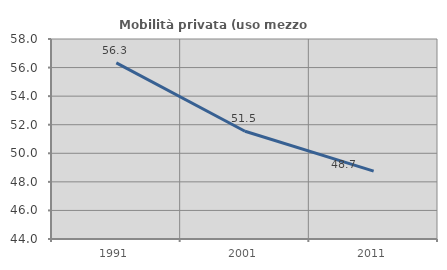
| Category | Mobilità privata (uso mezzo privato) |
|---|---|
| 1991.0 | 56.327 |
| 2001.0 | 51.542 |
| 2011.0 | 48.747 |